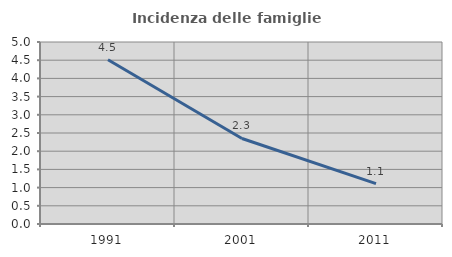
| Category | Incidenza delle famiglie numerose |
|---|---|
| 1991.0 | 4.511 |
| 2001.0 | 2.349 |
| 2011.0 | 1.108 |